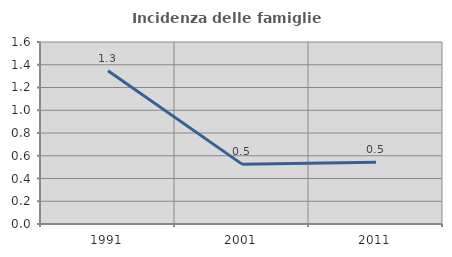
| Category | Incidenza delle famiglie numerose |
|---|---|
| 1991.0 | 1.347 |
| 2001.0 | 0.526 |
| 2011.0 | 0.543 |